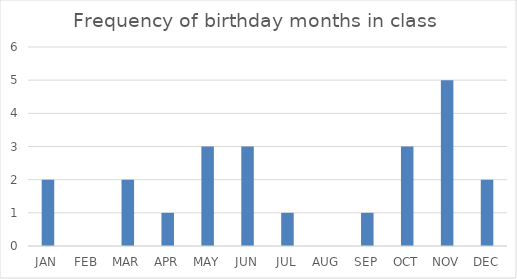
| Category | Series 0 |
|---|---|
| JAN | 2 |
| FEB | 0 |
| MAR | 2 |
| APR | 1 |
| MAY | 3 |
| JUN | 3 |
| JUL | 1 |
| AUG | 0 |
| SEP | 1 |
| OCT | 3 |
| NOV | 5 |
| DEC | 2 |